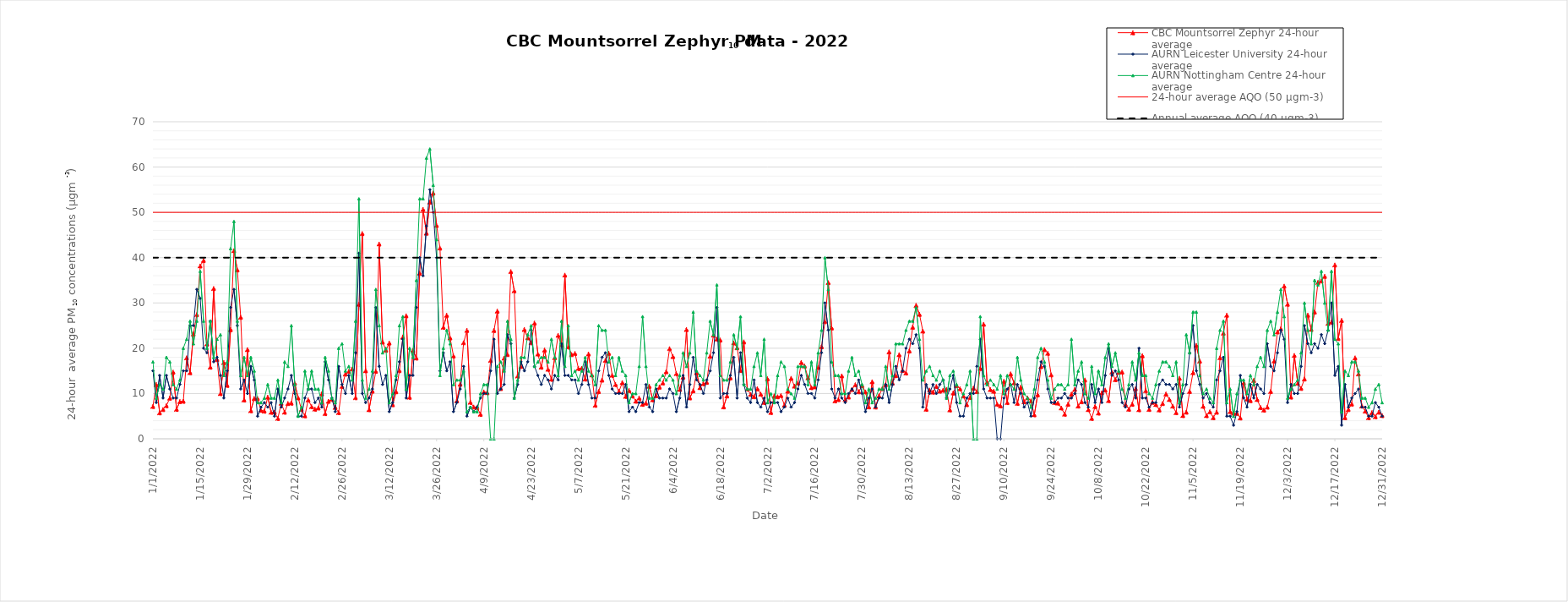
| Category | CBC Mountsorrel Zephyr 24-hour average | AURN Leicester University 24-hour average | AURN Nottingham Centre 24-hour average | 24-hour average AQO (50 µgm-3) | Annual average AQO (40 µgm-3) |
|---|---|---|---|---|---|
| 1/1/22 | 7.16 | 15 | 17 | 50 | 40 |
| 1/2/22 | 12 | 8 | 9 | 50 | 40 |
| 1/3/22 | 5.75 | 14 | 12 | 50 | 40 |
| 1/4/22 | 6.48 | 9 | 11 | 50 | 40 |
| 1/5/22 | 7.33 | 14 | 18 | 50 | 40 |
| 1/6/22 | 8.99 | 11 | 17 | 50 | 40 |
| 1/7/22 | 14.73 | 9 | 12 | 50 | 40 |
| 1/8/22 | 6.52 | 9 | 11 | 50 | 40 |
| 1/9/22 | 8.24 | 12 | 13 | 50 | 40 |
| 1/10/22 | 8.3 | 15 | 20 | 50 | 40 |
| 1/11/22 | 17.89 | 15 | 22 | 50 | 40 |
| 1/12/22 | 14.63 | 25 | 26 | 50 | 40 |
| 1/13/22 | 23.16 | 25 | 21 | 50 | 40 |
| 1/14/22 | 27.42 | 33 | 26 | 50 | 40 |
| 1/15/22 | 38.18 | 31 | 37 | 50 | 40 |
| 1/16/22 | 39.41 | 20 | 26 | 50 | 40 |
| 1/17/22 | 20.95 | 19 | 20 | 50 | 40 |
| 1/18/22 | 15.84 | 26 | 26 | 50 | 40 |
| 1/19/22 | 33.19 | 17 | 18 | 50 | 40 |
| 1/20/22 | 17.51 | 18 | 22 | 50 | 40 |
| 1/21/22 | 10 | 14 | 23 | 50 | 40 |
| 1/22/22 | 16.85 | 9 | 14 | 50 | 40 |
| 1/23/22 | 11.82 | 15 | 17 | 50 | 40 |
| 1/24/22 | 24.14 | 29 | 42 | 50 | 40 |
| 1/25/22 | 41.55 | 33 | 48 | 50 | 40 |
| 1/26/22 | 37.31 | 25 | 26 | 50 | 40 |
| 1/27/22 | 26.84 | 11 | 14 | 50 | 40 |
| 1/28/22 | 8.61 | 13 | 18 | 50 | 40 |
| 1/29/22 | 19.71 | 10 | 14 | 50 | 40 |
| 1/30/22 | 6.22 | 16 | 18 | 50 | 40 |
| 1/31/22 | 8.93 | 13 | 15 | 50 | 40 |
| 2/1/22 | 8.9 | 5 | 8 | 50 | 40 |
| 2/2/22 | 6.31 | 7 | 8 | 50 | 40 |
| 2/3/22 | 6.12 | 8 | 9 | 50 | 40 |
| 2/4/22 | 9.21 | 7 | 12 | 50 | 40 |
| 2/5/22 | 5.86 | 8 | 9 | 50 | 40 |
| 2/6/22 | 5.9 | 5 | 9 | 50 | 40 |
| 2/7/22 | 4.51 | 11 | 13 | 50 | 40 |
| 2/8/22 | 7.86 | 7 | 8 | 50 | 40 |
| 2/9/22 | 5.89 | 9 | 17 | 50 | 40 |
| 2/10/22 | 7.81 | 11 | 16 | 50 | 40 |
| 2/11/22 | 7.89 | 14 | 25 | 50 | 40 |
| 2/12/22 | 12.28 | 10 | 12 | 50 | 40 |
| 2/13/22 | 9.05 | 5 | 5 | 50 | 40 |
| 2/14/22 | 6.49 | 5 | 7 | 50 | 40 |
| 2/15/22 | 5.11 | 9 | 15 | 50 | 40 |
| 2/16/22 | 8.61 | 11 | 11 | 50 | 40 |
| 2/17/22 | 7.11 | 11 | 15 | 50 | 40 |
| 2/18/22 | 6.56 | 8 | 11 | 50 | 40 |
| 2/19/22 | 6.82 | 9 | 11 | 50 | 40 |
| 2/20/22 | 9.95 | 7 | 8 | 50 | 40 |
| 2/21/22 | 5.58 | 17 | 18 | 50 | 40 |
| 2/22/22 | 8.31 | 13 | 15 | 50 | 40 |
| 2/23/22 | 8.72 | 9 | 9 | 50 | 40 |
| 2/24/22 | 6.95 | 6 | 8 | 50 | 40 |
| 2/25/22 | 5.79 | 16 | 20 | 50 | 40 |
| 2/26/22 | 11.57 | 12 | 21 | 50 | 40 |
| 2/27/22 | 14.31 | 10 | 15 | 50 | 40 |
| 2/28/22 | 14.89 | 14 | 16 | 50 | 40 |
| 3/1/22 | 15.41 | 10 | 13 | 50 | 40 |
| 3/2/22 | 9.09 | 19 | 26 | 50 | 40 |
| 3/3/22 | 29.69 | 41 | 53 | 50 | 40 |
| 3/4/22 | 45.33 | 10 | 13 | 50 | 40 |
| 3/5/22 | 15.04 | 8 | 9 | 50 | 40 |
| 3/6/22 | 6.44 | 9 | 11 | 50 | 40 |
| 3/7/22 | 10.54 | 11 | 15 | 50 | 40 |
| 3/8/22 | 14.92 | 29 | 33 | 50 | 40 |
| 3/9/22 | 43.02 | 16 | 25 | 50 | 40 |
| 3/10/22 | 21.38 | 12 | 19 | 50 | 40 |
| 3/11/22 | 19.56 | 14 | 20 | 50 | 40 |
| 3/12/22 | 21.17 | 6 | 8 | 50 | 40 |
| 3/13/22 | 7.54 | 8 | 10 | 50 | 40 |
| 3/14/22 | 10.42 | 13 | 14 | 50 | 40 |
| 3/15/22 | 15.07 | 17 | 25 | 50 | 40 |
| 3/16/22 | 22.47 | 22 | 27 | 50 | 40 |
| 3/17/22 | 27.18 | 9 | 11 | 50 | 40 |
| 3/18/22 | 9.18 | 14 | 20 | 50 | 40 |
| 3/19/22 | 19.53 | 14 | 18 | 50 | 40 |
| 3/20/22 | 17.85 | 29 | 35 | 50 | 40 |
| 3/21/22 | 36.6 | 40 | 53 | 50 | 40 |
| 3/22/22 | 50.66 | 36 | 53 | 50 | 40 |
| 3/23/22 | 45.43 | 47 | 62 | 50 | 40 |
| 3/24/22 | 52.27 | 55 | 64 | 50 | 40 |
| 3/25/22 | 54.27 | 50 | 56 | 50 | 40 |
| 3/26/22 | 47.12 | 40 | 44 | 50 | 40 |
| 3/27/22 | 42.12 | 15 | 14 | 50 | 40 |
| 3/28/22 | 24.63 | 19 | 20 | 50 | 40 |
| 3/29/22 | 27.29 | 15 | 24 | 50 | 40 |
| 3/30/22 | 22.29 | 17 | 21 | 50 | 40 |
| 3/31/22 | 18.31 | 6 | 12 | 50 | 40 |
| 4/1/22 | 8.43 | 8 | 13 | 50 | 40 |
| 4/2/22 | 12.08 | 11 | 13 | 50 | 40 |
| 4/3/22 | 21.22 | 16 | 15 | 50 | 40 |
| 4/4/22 | 23.95 | 5 | 6 | 50 | 40 |
| 4/5/22 | 8.07 | 7 | 7 | 50 | 40 |
| 4/6/22 | 7.03 | 6 | 6 | 50 | 40 |
| 4/7/22 | 6.92 | 7 | 6 | 50 | 40 |
| 4/8/22 | 5.43 | 9 | 10 | 50 | 40 |
| 4/9/22 | 10.38 | 10 | 12 | 50 | 40 |
| 4/10/22 | 10.19 | 10 | 12 | 50 | 40 |
| 4/11/22 | 17.3 | 15 | 0 | 50 | 40 |
| 4/12/22 | 23.93 | 22 | 0 | 50 | 40 |
| 4/13/22 | 28.2 | 10 | 16 | 50 | 40 |
| 4/14/22 | 11.12 | 11 | 17 | 50 | 40 |
| 4/15/22 | 17.82 | 12 | 15 | 50 | 40 |
| 4/16/22 | 18.63 | 23 | 26 | 50 | 40 |
| 4/17/22 | 36.93 | 21 | 22 | 50 | 40 |
| 4/18/22 | 32.7 | 9 | 9 | 50 | 40 |
| 4/19/22 | 13.87 | 12 | 13 | 50 | 40 |
| 4/20/22 | 16 | 17 | 18 | 50 | 40 |
| 4/21/22 | 24.15 | 15 | 18 | 50 | 40 |
| 4/22/22 | 22.32 | 17 | 23 | 50 | 40 |
| 4/23/22 | 21.22 | 24 | 25 | 50 | 40 |
| 4/24/22 | 25.57 | 16 | 16 | 50 | 40 |
| 4/25/22 | 18.73 | 14 | 17 | 50 | 40 |
| 4/26/22 | 15.83 | 12 | 18 | 50 | 40 |
| 4/27/22 | 19.62 | 14 | 18 | 50 | 40 |
| 4/28/22 | 15.37 | 13 | 17 | 50 | 40 |
| 4/29/22 | 13.15 | 11 | 22 | 50 | 40 |
| 4/30/22 | 17.93 | 14 | 18 | 50 | 40 |
| 5/1/22 | 22.85 | 13 | 14 | 50 | 40 |
| 5/2/22 | 20.77 | 21 | 26 | 50 | 40 |
| 5/3/22 | 36.15 | 14 | 16 | 50 | 40 |
| 5/4/22 | 20.3 | 14 | 25 | 50 | 40 |
| 5/5/22 | 18.62 | 13 | 14 | 50 | 40 |
| 5/6/22 | 18.85 | 13 | 15 | 50 | 40 |
| 5/7/22 | 15.54 | 10 | 13 | 50 | 40 |
| 5/8/22 | 15.57 | 12 | 15 | 50 | 40 |
| 5/9/22 | 13.2 | 17 | 18 | 50 | 40 |
| 5/10/22 | 18.74 | 12 | 15 | 50 | 40 |
| 5/11/22 | 14.09 | 9 | 14 | 50 | 40 |
| 5/12/22 | 7.42 | 9 | 12 | 50 | 40 |
| 5/13/22 | 10.45 | 15 | 25 | 50 | 40 |
| 5/14/22 | 12.98 | 18 | 24 | 50 | 40 |
| 5/15/22 | 17.32 | 19 | 24 | 50 | 40 |
| 5/16/22 | 18.88 | 14 | 17 | 50 | 40 |
| 5/17/22 | 14.03 | 11 | 18 | 50 | 40 |
| 5/18/22 | 12 | 10 | 14 | 50 | 40 |
| 5/19/22 | 10.44 | 10 | 18 | 50 | 40 |
| 5/20/22 | 12.43 | 10 | 15 | 50 | 40 |
| 5/21/22 | 9.38 | 12 | 14 | 50 | 40 |
| 5/22/22 | 10.69 | 6 | 8 | 50 | 40 |
| 5/23/22 | 9.47 | 7 | 10 | 50 | 40 |
| 5/24/22 | 8.32 | 6 | 10 | 50 | 40 |
| 5/25/22 | 9.01 | 8 | 16 | 50 | 40 |
| 5/26/22 | 7.63 | 8 | 27 | 50 | 40 |
| 5/27/22 | 7.88 | 12 | 16 | 50 | 40 |
| 5/28/22 | 11.6 | 7 | 9 | 50 | 40 |
| 5/29/22 | 8.62 | 6 | 9 | 50 | 40 |
| 5/30/22 | 9.52 | 11 | 12 | 50 | 40 |
| 5/31/22 | 11.43 | 9 | 13 | 50 | 40 |
| 6/1/22 | 12.35 | 9 | 14 | 50 | 40 |
| 6/2/22 | 14.82 | 9 | 13 | 50 | 40 |
| 6/3/22 | 19.91 | 11 | 14 | 50 | 40 |
| 6/4/22 | 18.17 | 10 | 13 | 50 | 40 |
| 6/5/22 | 14.4 | 6 | 10 | 50 | 40 |
| 6/6/22 | 10.92 | 9 | 14 | 50 | 40 |
| 6/7/22 | 13.64 | 14 | 19 | 50 | 40 |
| 6/8/22 | 24.13 | 7 | 16 | 50 | 40 |
| 6/9/22 | 9.05 | 12 | 19 | 50 | 40 |
| 6/10/22 | 10.62 | 18 | 28 | 50 | 40 |
| 6/11/22 | 14.61 | 13 | 15 | 50 | 40 |
| 6/12/22 | 11.31 | 12 | 14 | 50 | 40 |
| 6/13/22 | 12.18 | 10 | 13 | 50 | 40 |
| 6/14/22 | 12.49 | 13 | 19 | 50 | 40 |
| 6/15/22 | 18.24 | 15 | 26 | 50 | 40 |
| 6/16/22 | 22.91 | 19 | 23 | 50 | 40 |
| 6/17/22 | 22.03 | 29 | 34 | 50 | 40 |
| 6/18/22 | 21.82 | 9 | 14 | 50 | 40 |
| 6/19/22 | 7.07 | 10 | 13 | 50 | 40 |
| 6/20/22 | 9.48 | 10 | 13 | 50 | 40 |
| 6/21/22 | 13.49 | 14 | 17 | 50 | 40 |
| 6/22/22 | 21.19 | 18 | 23 | 50 | 40 |
| 6/23/22 | 20.12 | 9 | 20 | 50 | 40 |
| 6/24/22 | 15.1 | 19 | 27 | 50 | 40 |
| 6/25/22 | 21.41 | 12 | 12 | 50 | 40 |
| 6/26/22 | 11.01 | 9 | 11 | 50 | 40 |
| 6/27/22 | 9.82 | 8 | 11 | 50 | 40 |
| 6/28/22 | 9.31 | 13 | 16 | 50 | 40 |
| 6/29/22 | 11.08 | 8 | 19 | 50 | 40 |
| 6/30/22 | 9.87 | 7 | 14 | 50 | 40 |
| 7/1/22 | 8.05 | 9 | 22 | 50 | 40 |
| 7/2/22 | 13.27 | 6 | 8 | 50 | 40 |
| 7/3/22 | 5.83 | 8 | 10 | 50 | 40 |
| 7/4/22 | 9.48 | 8 | 8 | 50 | 40 |
| 7/5/22 | 9.29 | 8 | 14 | 50 | 40 |
| 7/6/22 | 9.55 | 6 | 17 | 50 | 40 |
| 7/7/22 | 7.45 | 7 | 16 | 50 | 40 |
| 7/8/22 | 10.53 | 9 | 11 | 50 | 40 |
| 7/9/22 | 13.37 | 7 | 10 | 50 | 40 |
| 7/10/22 | 11.64 | 8 | 9 | 50 | 40 |
| 7/11/22 | 12.3 | 11 | 16 | 50 | 40 |
| 7/12/22 | 16.87 | 14 | 16 | 50 | 40 |
| 7/13/22 | 16.08 | 12 | 16 | 50 | 40 |
| 7/14/22 | 13.47 | 10 | 12 | 50 | 40 |
| 7/15/22 | 11.31 | 10 | 17 | 50 | 40 |
| 7/16/22 | 11.48 | 9 | 12 | 50 | 40 |
| 7/17/22 | 15.79 | 13 | 19 | 50 | 40 |
| 7/18/22 | 20.35 | 19 | 24 | 50 | 40 |
| 7/19/22 | 25.88 | 30 | 40 | 50 | 40 |
| 7/20/22 | 34.5 | 24 | 33 | 50 | 40 |
| 7/21/22 | 24.5 | 11 | 17 | 50 | 40 |
| 7/22/22 | 8.39 | 9 | 14 | 50 | 40 |
| 7/23/22 | 8.68 | 11 | 14 | 50 | 40 |
| 7/24/22 | 13.91 | 9 | 10 | 50 | 40 |
| 7/25/22 | 8.67 | 8 | 10 | 50 | 40 |
| 7/26/22 | 9.24 | 10 | 15 | 50 | 40 |
| 7/27/22 | 10.91 | 11 | 18 | 50 | 40 |
| 7/28/22 | 11.94 | 10 | 14 | 50 | 40 |
| 7/29/22 | 10.4 | 13 | 15 | 50 | 40 |
| 7/30/22 | 11.78 | 10 | 12 | 50 | 40 |
| 7/31/22 | 10.37 | 6 | 8 | 50 | 40 |
| 8/1/22 | 7.07 | 9 | 11 | 50 | 40 |
| 8/2/22 | 12.61 | 11 | 8 | 50 | 40 |
| 8/3/22 | 7.03 | 7 | 9 | 50 | 40 |
| 8/4/22 | 9.49 | 9 | 11 | 50 | 40 |
| 8/5/22 | 11.09 | 9 | 11 | 50 | 40 |
| 8/6/22 | 12 | 12 | 16 | 50 | 40 |
| 8/7/22 | 19.2 | 8 | 11 | 50 | 40 |
| 8/8/22 | 12.32 | 12 | 14 | 50 | 40 |
| 8/9/22 | 13.97 | 16 | 21 | 50 | 40 |
| 8/10/22 | 18.59 | 13 | 21 | 50 | 40 |
| 8/11/22 | 15.13 | 15 | 21 | 50 | 40 |
| 8/12/22 | 14.55 | 20 | 24 | 50 | 40 |
| 8/13/22 | 19.42 | 22 | 26 | 50 | 40 |
| 8/14/22 | 24.66 | 21 | 26 | 50 | 40 |
| 8/15/22 | 29.47 | 23 | 29 | 50 | 40 |
| 8/16/22 | 27.48 | 20 | 22 | 50 | 40 |
| 8/17/22 | 23.78 | 7 | 13 | 50 | 40 |
| 8/18/22 | 6.55 | 12 | 15 | 50 | 40 |
| 8/19/22 | 10.76 | 10 | 16 | 50 | 40 |
| 8/20/22 | 10.32 | 12 | 14 | 50 | 40 |
| 8/21/22 | 11.56 | 10 | 13 | 50 | 40 |
| 8/22/22 | 10.53 | 12 | 15 | 50 | 40 |
| 8/23/22 | 10.73 | 13 | 13 | 50 | 40 |
| 8/24/22 | 10.9 | 9 | 9 | 50 | 40 |
| 8/25/22 | 6.4 | 11 | 14 | 50 | 40 |
| 8/26/22 | 10.13 | 14 | 15 | 50 | 40 |
| 8/27/22 | 11.77 | 8 | 12 | 50 | 40 |
| 8/28/22 | 11.06 | 5 | 8 | 50 | 40 |
| 8/29/22 | 9.47 | 5 | 10 | 50 | 40 |
| 8/30/22 | 7.56 | 9 | 12 | 50 | 40 |
| 8/31/22 | 9.15 | 10 | 15 | 50 | 40 |
| 9/1/22 | 11.22 | 10 | 0 | 50 | 40 |
| 9/2/22 | 10.43 | 16 | 0 | 50 | 40 |
| 9/3/22 | 15.56 | 22 | 27 | 50 | 40 |
| 9/4/22 | 25.31 | 11 | 14 | 50 | 40 |
| 9/5/22 | 12.51 | 9 | 12 | 50 | 40 |
| 9/6/22 | 10.88 | 9 | 13 | 50 | 40 |
| 9/7/22 | 10.51 | 9 | 12 | 50 | 40 |
| 9/8/22 | 7.65 | 0 | 11 | 50 | 40 |
| 9/9/22 | 7.28 | 0 | 14 | 50 | 40 |
| 9/10/22 | 12.71 | 9 | 10 | 50 | 40 |
| 9/11/22 | 8.01 | 11 | 14 | 50 | 40 |
| 9/12/22 | 14.35 | 12 | 12 | 50 | 40 |
| 9/13/22 | 12.35 | 8 | 11 | 50 | 40 |
| 9/14/22 | 7.85 | 12 | 18 | 50 | 40 |
| 9/15/22 | 11.41 | 10 | 13 | 50 | 40 |
| 9/16/22 | 8.19 | 7 | 10 | 50 | 40 |
| 9/17/22 | 9.04 | 8 | 9 | 50 | 40 |
| 9/18/22 | 8.37 | 5 | 7 | 50 | 40 |
| 9/19/22 | 5.31 | 9 | 11 | 50 | 40 |
| 9/20/22 | 9.75 | 13 | 18 | 50 | 40 |
| 9/21/22 | 15.98 | 17 | 20 | 50 | 40 |
| 9/22/22 | 19.72 | 16 | 17 | 50 | 40 |
| 9/23/22 | 18.88 | 11 | 13 | 50 | 40 |
| 9/24/22 | 14.13 | 8 | 9 | 50 | 40 |
| 9/25/22 | 8.01 | 8 | 11 | 50 | 40 |
| 9/26/22 | 7.89 | 9 | 12 | 50 | 40 |
| 9/27/22 | 6.81 | 9 | 12 | 50 | 40 |
| 9/28/22 | 5.45 | 10 | 11 | 50 | 40 |
| 9/29/22 | 7.66 | 9 | 12 | 50 | 40 |
| 9/30/22 | 9.88 | 9 | 22 | 50 | 40 |
| 10/1/22 | 10.94 | 10 | 12 | 50 | 40 |
| 10/2/22 | 7.25 | 13 | 15 | 50 | 40 |
| 10/3/22 | 8.2 | 12 | 17 | 50 | 40 |
| 10/4/22 | 13 | 8 | 10 | 50 | 40 |
| 10/5/22 | 6.45 | 7 | 9 | 50 | 40 |
| 10/6/22 | 4.52 | 12 | 16 | 50 | 40 |
| 10/7/22 | 7.14 | 8 | 10 | 50 | 40 |
| 10/8/22 | 5.69 | 11 | 15 | 50 | 40 |
| 10/9/22 | 10.18 | 8 | 12 | 50 | 40 |
| 10/10/22 | 10.77 | 14 | 18 | 50 | 40 |
| 10/11/22 | 8.47 | 20 | 21 | 50 | 40 |
| 10/12/22 | 14.74 | 14 | 16 | 50 | 40 |
| 10/13/22 | 13.07 | 15 | 19 | 50 | 40 |
| 10/14/22 | 14.71 | 13 | 15 | 50 | 40 |
| 10/15/22 | 14.75 | 8 | 11 | 50 | 40 |
| 10/16/22 | 7.61 | 7 | 9 | 50 | 40 |
| 10/17/22 | 6.55 | 11 | 12 | 50 | 40 |
| 10/18/22 | 7.65 | 12 | 17 | 50 | 40 |
| 10/19/22 | 11.09 | 9 | 13 | 50 | 40 |
| 10/20/22 | 6.43 | 20 | 19 | 50 | 40 |
| 10/21/22 | 18.35 | 9 | 14 | 50 | 40 |
| 10/22/22 | 10.62 | 9 | 14 | 50 | 40 |
| 10/23/22 | 6.5 | 7 | 10 | 50 | 40 |
| 10/24/22 | 8.08 | 8 | 9 | 50 | 40 |
| 10/25/22 | 7.57 | 8 | 12 | 50 | 40 |
| 10/26/22 | 6.39 | 12 | 15 | 50 | 40 |
| 10/27/22 | 7.8 | 13 | 17 | 50 | 40 |
| 10/28/22 | 9.9 | 12 | 17 | 50 | 40 |
| 10/29/22 | 8.7 | 12 | 16 | 50 | 40 |
| 10/30/22 | 7.22 | 11 | 14 | 50 | 40 |
| 10/31/22 | 5.78 | 12 | 17 | 50 | 40 |
| 11/1/22 | 13.38 | 7 | 8 | 50 | 40 |
| 11/2/22 | 5.15 | 10 | 12 | 50 | 40 |
| 11/3/22 | 5.9 | 12 | 23 | 50 | 40 |
| 11/4/22 | 10.47 | 19 | 19 | 50 | 40 |
| 11/5/22 | 14.63 | 25 | 28 | 50 | 40 |
| 11/6/22 | 20.64 | 15 | 28 | 50 | 40 |
| 11/7/22 | 17.16 | 12 | 14 | 50 | 40 |
| 11/8/22 | 7.18 | 9 | 10 | 50 | 40 |
| 11/9/22 | 5.13 | 10 | 11 | 50 | 40 |
| 11/10/22 | 5.98 | 8 | 9 | 50 | 40 |
| 11/11/22 | 4.68 | 7 | 8 | 50 | 40 |
| 11/12/22 | 5.89 | 13 | 20 | 50 | 40 |
| 11/13/22 | 17.9 | 15 | 24 | 50 | 40 |
| 11/14/22 | 23.33 | 18 | 26 | 50 | 40 |
| 11/15/22 | 27.3 | 5 | 8 | 50 | 40 |
| 11/16/22 | 6.01 | 5 | 11 | 50 | 40 |
| 11/17/22 | 5.66 | 3 | 5 | 50 | 40 |
| 11/18/22 | 5.64 | 6 | 10 | 50 | 40 |
| 11/19/22 | 4.62 | 14 | 13 | 50 | 40 |
| 11/20/22 | 12.39 | 9 | 13 | 50 | 40 |
| 11/21/22 | 8.78 | 7 | 10 | 50 | 40 |
| 11/22/22 | 8.45 | 12 | 14 | 50 | 40 |
| 11/23/22 | 12.9 | 9 | 12 | 50 | 40 |
| 11/24/22 | 8.69 | 12 | 16 | 50 | 40 |
| 11/25/22 | 6.91 | 11 | 18 | 50 | 40 |
| 11/26/22 | 6.37 | 10 | 16 | 50 | 40 |
| 11/27/22 | 7.01 | 21 | 24 | 50 | 40 |
| 11/28/22 | 10.46 | 16 | 26 | 50 | 40 |
| 11/29/22 | 17.18 | 15 | 23 | 50 | 40 |
| 11/30/22 | 23.62 | 19 | 28 | 50 | 40 |
| 12/1/22 | 24.3 | 24 | 33 | 50 | 40 |
| 12/2/22 | 33.72 | 22 | 27 | 50 | 40 |
| 12/3/22 | 29.73 | 8 | 9 | 50 | 40 |
| 12/4/22 | 9.22 | 12 | 11 | 50 | 40 |
| 12/5/22 | 18.42 | 10 | 12 | 50 | 40 |
| 12/6/22 | 12.26 | 10 | 13 | 50 | 40 |
| 12/7/22 | 11.15 | 16 | 19 | 50 | 40 |
| 12/8/22 | 13.23 | 25 | 30 | 50 | 40 |
| 12/9/22 | 27.32 | 21 | 24 | 50 | 40 |
| 12/10/22 | 24.17 | 19 | 21 | 50 | 40 |
| 12/11/22 | 28.01 | 21 | 35 | 50 | 40 |
| 12/12/22 | 34.55 | 20 | 34 | 50 | 40 |
| 12/13/22 | 34.86 | 23 | 37 | 50 | 40 |
| 12/14/22 | 35.89 | 21 | 30 | 50 | 40 |
| 12/15/22 | 25.49 | 24 | 24 | 50 | 40 |
| 12/16/22 | 25.76 | 30 | 37 | 50 | 40 |
| 12/17/22 | 38.39 | 14 | 22 | 50 | 40 |
| 12/18/22 | 22.15 | 16 | 21 | 50 | 40 |
| 12/19/22 | 26.15 | 3 | 6 | 50 | 40 |
| 12/20/22 | 4.68 | 12 | 15 | 50 | 40 |
| 12/21/22 | 6.48 | 7 | 14 | 50 | 40 |
| 12/22/22 | 7.69 | 9 | 17 | 50 | 40 |
| 12/23/22 | 17.88 | 10 | 17 | 50 | 40 |
| 12/24/22 | 14.34 | 11 | 15 | 50 | 40 |
| 12/25/22 | 7.25 | 7 | 9 | 50 | 40 |
| 12/26/22 | 6.12 | 7 | 9 | 50 | 40 |
| 12/27/22 | 4.68 | 5 | 7 | 50 | 40 |
| 12/28/22 | 5.8 | 5 | 8 | 50 | 40 |
| 12/29/22 | 4.9 | 8 | 11 | 50 | 40 |
| 12/30/22 | 5.89 | 7 | 12 | 50 | 40 |
| 12/31/22 | 5.14 | 5 | 8 | 50 | 40 |